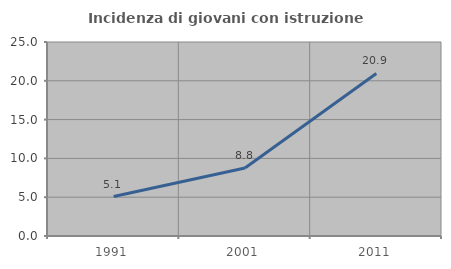
| Category | Incidenza di giovani con istruzione universitaria |
|---|---|
| 1991.0 | 5.085 |
| 2001.0 | 8.767 |
| 2011.0 | 20.948 |